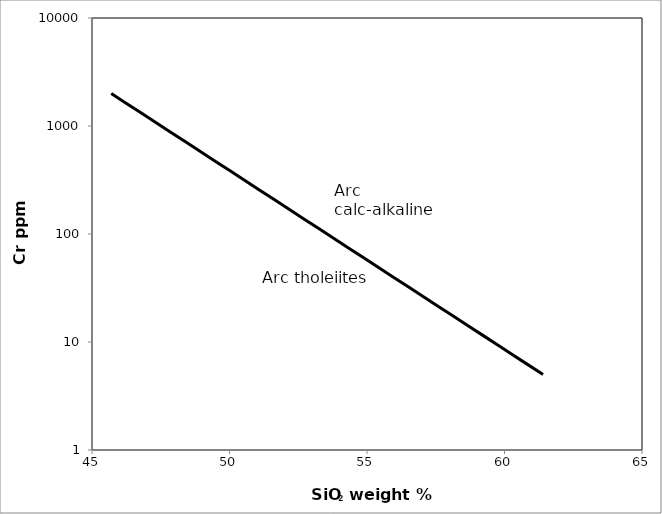
| Category | Series 0 |
|---|---|
| 45.7 | 2000 |
| 46.24 | 1627.507 |
| 46.78 | 1324.42 |
| 47.32 | 1077.776 |
| 47.86 | 877.064 |
| 48.4 | 713.731 |
| 48.94 | 580.814 |
| 49.48 | 472.651 |
| 50.019999999999996 | 384.63 |
| 50.559999999999995 | 313.001 |
| 51.099999999999994 | 254.712 |
| 51.63999999999999 | 207.277 |
| 52.17999999999999 | 168.677 |
| 52.71999999999999 | 137.264 |
| 53.25999999999999 | 111.702 |
| 53.79999999999999 | 90.9 |
| 54.33999999999999 | 73.972 |
| 54.87999999999999 | 60.196 |
| 55.41999999999999 | 48.986 |
| 55.95999999999999 | 39.863 |
| 56.499999999999986 | 32.44 |
| 57.039999999999985 | 26.399 |
| 57.579999999999984 | 21.482 |
| 58.11999999999998 | 17.482 |
| 58.65999999999998 | 14.226 |
| 59.19999999999998 | 11.577 |
| 59.73999999999998 | 9.421 |
| 60.27999999999998 | 7.667 |
| 60.81999999999998 | 6.239 |
| 61.35999999999998 | 5.077 |
| 61.4 | 5 |